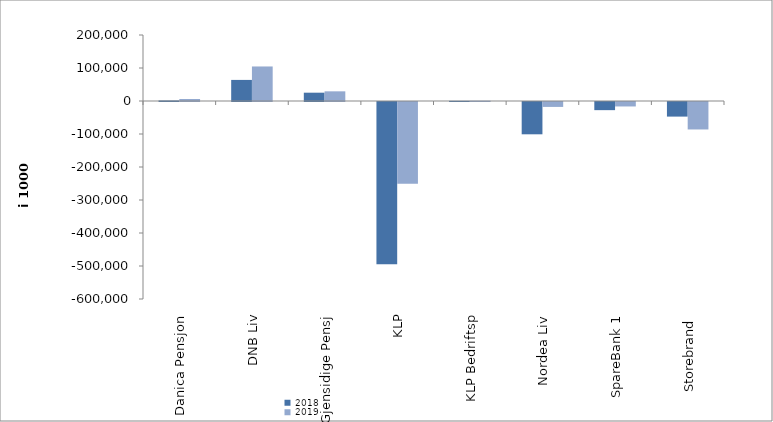
| Category | 2018 | 2019 |
|---|---|---|
| Danica Pensjon | 1705.495 | 6109.953 |
| DNB Liv | 63897 | 104640 |
| Gjensidige Pensj | 25183 | 29298.6 |
| KLP | -491437.522 | -248064.624 |
| KLP Bedriftsp | 491 | 878 |
| Nordea Liv | -97885.51 | -14915.334 |
| SpareBank 1 | -24690.168 | -13521.345 |
| Storebrand  | -44260.928 | -83232.048 |